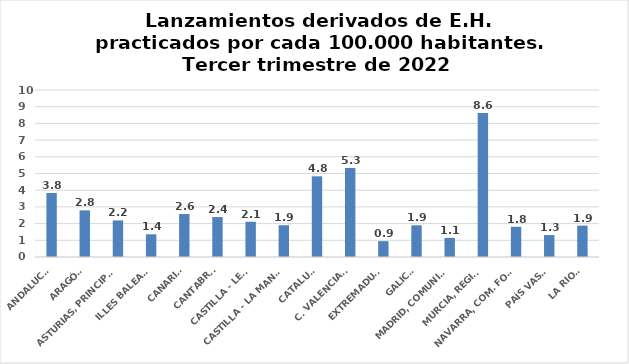
| Category | Series 0 |
|---|---|
| ANDALUCÍA | 3.833 |
| ARAGÓN | 2.792 |
| ASTURIAS, PRINCIPADO | 2.19 |
| ILLES BALEARS | 1.36 |
| CANARIAS | 2.573 |
| CANTABRIA | 2.392 |
| CASTILLA - LEÓN | 2.11 |
| CASTILLA - LA MANCHA | 1.9 |
| CATALUÑA | 4.831 |
| C. VALENCIANA | 5.323 |
| EXTREMADURA | 0.949 |
| GALICIA | 1.897 |
| MADRID, COMUNIDAD | 1.142 |
| MURCIA, REGIÓN | 8.619 |
| NAVARRA, COM. FORAL | 1.808 |
| PAÍS VASCO | 1.314 |
| LA RIOJA | 1.878 |